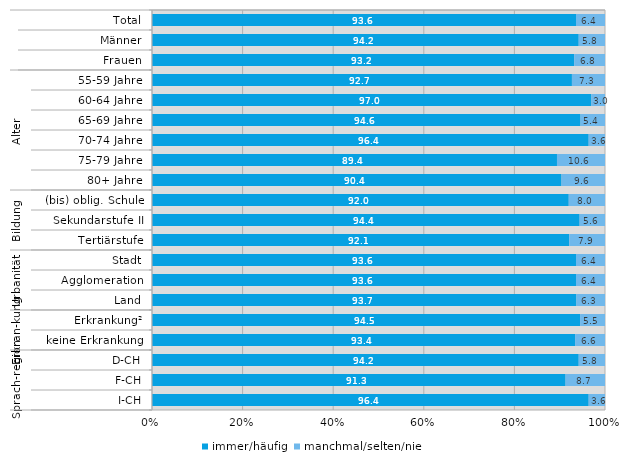
| Category | immer/häufig | manchmal/selten/nie |
|---|---|---|
| 0 | 93.6 | 6.4 |
| 1 | 94.2 | 5.8 |
| 2 | 93.2 | 6.8 |
| 3 | 92.7 | 7.3 |
| 4 | 97 | 3 |
| 5 | 94.6 | 5.4 |
| 6 | 96.4 | 3.6 |
| 7 | 89.4 | 10.6 |
| 8 | 90.4 | 9.6 |
| 9 | 92 | 8 |
| 10 | 94.4 | 5.6 |
| 11 | 92.1 | 7.9 |
| 12 | 93.6 | 6.4 |
| 13 | 93.6 | 6.4 |
| 14 | 93.7 | 6.3 |
| 15 | 94.5 | 5.5 |
| 16 | 93.4 | 6.6 |
| 17 | 94.2 | 5.8 |
| 18 | 91.3 | 8.7 |
| 19 | 96.4 | 3.6 |